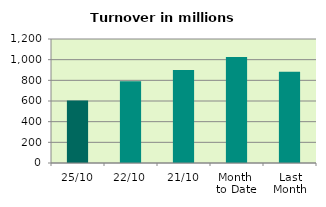
| Category | Series 0 |
|---|---|
| 25/10 | 604.282 |
| 22/10 | 790.426 |
| 21/10 | 899.311 |
| Month 
to Date | 1026.637 |
| Last
Month | 883.598 |